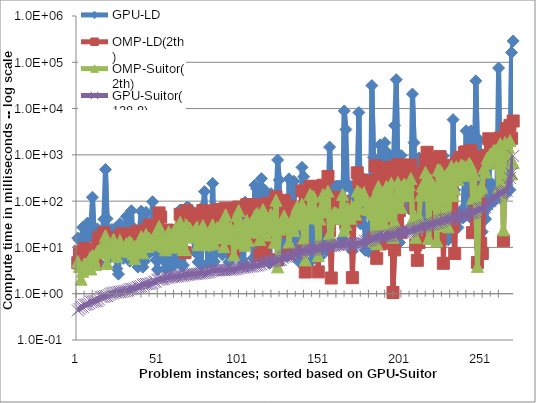
| Category | GPU-LD | OMP-LD(2th) | OMP-Suitor(2th) | GPU-Suitor(128,8) |
|---|---|---|---|---|
| 0 | 15.91 | 4.671 | 4.951 | 0.434 |
| 1 | 14.461 | 8.024 | 3.904 | 0.469 |
| 2 | 7.775 | 4.176 | 2.056 | 0.506 |
| 3 | 27.187 | 5.994 | 3.056 | 0.526 |
| 4 | 14.246 | 9.438 | 4.422 | 0.57 |
| 5 | 4.107 | 6.901 | 4.413 | 0.583 |
| 6 | 33.759 | 8.322 | 4.343 | 0.593 |
| 7 | 16.807 | 8.298 | 5.392 | 0.621 |
| 8 | 25.256 | 8.299 | 3.427 | 0.663 |
| 9 | 121.316 | 7.65 | 6.718 | 0.679 |
| 10 | 19.372 | 7.215 | 5.441 | 0.685 |
| 11 | 6.16 | 4.676 | 4.297 | 0.694 |
| 12 | 25.181 | 11.028 | 8.163 | 0.702 |
| 13 | 4.747 | 16.526 | 8.479 | 0.752 |
| 14 | 20.518 | 10.923 | 9.682 | 0.847 |
| 15 | 23.158 | 10.789 | 7.65 | 0.859 |
| 16 | 40.667 | 20.636 | 9.407 | 0.861 |
| 17 | 483.357 | 15.24 | 18.041 | 0.886 |
| 18 | 41.804 | 10.188 | 4.506 | 0.889 |
| 19 | 12.23 | 14.366 | 7.773 | 0.93 |
| 20 | 6.116 | 8.333 | 9.363 | 0.988 |
| 21 | 24.493 | 15.624 | 7.755 | 1.017 |
| 22 | 12.093 | 16.281 | 14.967 | 1.036 |
| 23 | 25.358 | 16.376 | 7.733 | 1.062 |
| 24 | 3.473 | 11.929 | 6.462 | 1.062 |
| 25 | 2.648 | 9.246 | 10.371 | 1.087 |
| 26 | 32.742 | 14.391 | 13.728 | 1.089 |
| 27 | 15.403 | 19.722 | 10.891 | 1.111 |
| 28 | 5.821 | 9.11 | 9.56 | 1.12 |
| 29 | 27.19 | 16.952 | 8.691 | 1.139 |
| 30 | 46.903 | 17.445 | 12.319 | 1.157 |
| 31 | 27.356 | 19.223 | 8.191 | 1.188 |
| 32 | 5.051 | 11.936 | 13.262 | 1.246 |
| 33 | 61.984 | 16.839 | 12.208 | 1.266 |
| 34 | 10.684 | 14.485 | 7.226 | 1.272 |
| 35 | 24.961 | 13.737 | 5.759 | 1.294 |
| 36 | 10.868 | 21.941 | 10.565 | 1.337 |
| 37 | 3.775 | 14.532 | 9.298 | 1.403 |
| 38 | 24.833 | 16.702 | 8.737 | 1.412 |
| 39 | 60.601 | 22.22 | 17.133 | 1.454 |
| 40 | 3.756 | 13.181 | 7.65 | 1.558 |
| 41 | 5.01 | 20.472 | 10.507 | 1.598 |
| 42 | 57.403 | 23.839 | 18.982 | 1.617 |
| 43 | 7.087 | 14.071 | 10.607 | 1.627 |
| 44 | 24.702 | 30.407 | 15.87 | 1.637 |
| 45 | 8.73 | 19.257 | 14.334 | 1.67 |
| 46 | 97.021 | 28.357 | 14.916 | 1.688 |
| 47 | 8.382 | 17.689 | 17.046 | 1.8 |
| 48 | 5.353 | 18.171 | 13.657 | 1.819 |
| 49 | 3.316 | 12.181 | 11.375 | 1.994 |
| 50 | 39.511 | 55.622 | 28.408 | 2.027 |
| 51 | 16.812 | 45.498 | 19.664 | 2.057 |
| 52 | 5.474 | 17.762 | 15.929 | 2.066 |
| 53 | 11.148 | 13.124 | 10.517 | 2.067 |
| 54 | 3.452 | 13.478 | 8.896 | 2.194 |
| 55 | 18.18 | 23.74 | 11.082 | 2.223 |
| 56 | 8.872 | 14.38 | 21.959 | 2.236 |
| 57 | 3.766 | 15.569 | 10.246 | 2.296 |
| 58 | 4.335 | 14.012 | 13.837 | 2.297 |
| 59 | 4.04 | 14.975 | 10.608 | 2.321 |
| 60 | 6.384 | 23.106 | 25.558 | 2.35 |
| 61 | 5.572 | 14.674 | 10.248 | 2.37 |
| 62 | 6.103 | 18.702 | 17.811 | 2.389 |
| 63 | 64.244 | 52.032 | 35.081 | 2.453 |
| 64 | 3.946 | 27.133 | 10.343 | 2.455 |
| 65 | 4.143 | 17.925 | 8.994 | 2.462 |
| 66 | 16.515 | 7.702 | 9.097 | 2.553 |
| 67 | 73.311 | 62.437 | 30.066 | 2.564 |
| 68 | 73.561 | 44.112 | 26.458 | 2.579 |
| 69 | 67.333 | 46.48 | 25.918 | 2.62 |
| 70 | 18.768 | 24.846 | 16.701 | 2.631 |
| 71 | 18.806 | 28.494 | 17.794 | 2.649 |
| 72 | 8.046 | 31.339 | 23.272 | 2.676 |
| 73 | 24.874 | 53.236 | 26.586 | 2.688 |
| 74 | 4.811 | 17.181 | 11.471 | 2.707 |
| 75 | 4.729 | 16.659 | 14.682 | 2.739 |
| 76 | 4.266 | 17.142 | 12.431 | 2.762 |
| 77 | 75.829 | 62.507 | 29.531 | 2.815 |
| 78 | 160.408 | 43.318 | 24.712 | 2.831 |
| 79 | 27.003 | 13.859 | 13.522 | 2.845 |
| 80 | 4.508 | 20.349 | 11.454 | 2.908 |
| 81 | 11.272 | 24.473 | 21.432 | 2.95 |
| 82 | 4.696 | 23.65 | 17.106 | 3.078 |
| 83 | 242.102 | 59.52 | 30.832 | 3.174 |
| 84 | 4.949 | 22.423 | 11.947 | 3.184 |
| 85 | 7.637 | 13.268 | 18.974 | 3.188 |
| 86 | 26.871 | 66.194 | 27.583 | 3.207 |
| 87 | 22.332 | 23.972 | 17.137 | 3.221 |
| 88 | 41.367 | 62.46 | 30.074 | 3.225 |
| 89 | 6.899 | 30.416 | 16.284 | 3.228 |
| 90 | 22.581 | 23.894 | 10.453 | 3.248 |
| 91 | 29.436 | 70.668 | 50.611 | 3.268 |
| 92 | 20.323 | 13.704 | 17.381 | 3.296 |
| 93 | 4.778 | 26.608 | 15.449 | 3.302 |
| 94 | 46.016 | 20.243 | 26.877 | 3.32 |
| 95 | 14.278 | 42.363 | 21.789 | 3.324 |
| 96 | 70.263 | 8.672 | 6.894 | 3.373 |
| 97 | 47.326 | 38.677 | 23.344 | 3.409 |
| 98 | 29.633 | 71.311 | 48.939 | 3.475 |
| 99 | 29.668 | 74.705 | 62.669 | 3.554 |
| 100 | 52 | 19.494 | 12.541 | 3.635 |
| 101 | 5.557 | 29.032 | 15.808 | 3.67 |
| 102 | 4.632 | 25.605 | 22.196 | 3.688 |
| 103 | 95.19 | 20.041 | 11.142 | 3.714 |
| 104 | 50.421 | 83.706 | 38.346 | 3.765 |
| 105 | 58.29 | 25.495 | 14.001 | 3.843 |
| 106 | 16.184 | 13.855 | 29.1 | 3.872 |
| 107 | 71.167 | 75.136 | 34.527 | 3.886 |
| 108 | 5.853 | 35.458 | 22.7 | 3.938 |
| 109 | 221.72 | 84.412 | 47.925 | 4.04 |
| 110 | 186.194 | 79.814 | 53.618 | 4.088 |
| 111 | 7.156 | 33.644 | 21.39 | 4.093 |
| 112 | 11.365 | 6.715 | 14.809 | 4.294 |
| 113 | 306.585 | 79.347 | 45.059 | 4.316 |
| 114 | 65.668 | 83.125 | 65.905 | 4.669 |
| 115 | 173.012 | 8.405 | 19.662 | 4.715 |
| 116 | 8.342 | 21.781 | 18.526 | 4.75 |
| 117 | 76.257 | 88.575 | 38.06 | 4.819 |
| 118 | 4.55 | 24.609 | 23.56 | 4.97 |
| 119 | 144.848 | 85.721 | 51.586 | 4.992 |
| 120 | 100.81 | 91.744 | 46.888 | 5.081 |
| 121 | 68.162 | 13.968 | 12.944 | 5.099 |
| 122 | 78.563 | 123.754 | 104.229 | 5.16 |
| 123 | 776.093 | 5.425 | 3.808 | 5.319 |
| 124 | 286.859 | 51.372 | 24.799 | 5.344 |
| 125 | 6.49 | 50.586 | 33.079 | 5.404 |
| 126 | 10.149 | 52.933 | 35.224 | 5.952 |
| 127 | 15.554 | 104.255 | 47.896 | 6.279 |
| 128 | 6.467 | 22.473 | 27.684 | 6.383 |
| 129 | 6.48 | 22.731 | 28.602 | 6.385 |
| 130 | 303.041 | 7.388 | 13.025 | 6.418 |
| 131 | 34.222 | 78.032 | 34.668 | 6.676 |
| 132 | 13.256 | 67.458 | 35.968 | 6.727 |
| 133 | 268.368 | 42.662 | 23.183 | 7.166 |
| 134 | 9.355 | 69.378 | 59.187 | 7.32 |
| 135 | 9.32 | 67.561 | 76.043 | 7.336 |
| 136 | 4.992 | 52.849 | 32.252 | 7.565 |
| 137 | 11.056 | 72.036 | 58.084 | 8.139 |
| 138 | 536.933 | 166.699 | 86.084 | 8.317 |
| 139 | 335.604 | 10.41 | 15.832 | 8.49 |
| 140 | 88.16 | 2.943 | 5.371 | 8.606 |
| 141 | 136.404 | 120.445 | 54.54 | 8.699 |
| 142 | 137.257 | 119.277 | 49.515 | 8.708 |
| 143 | 67.132 | 206.891 | 140.702 | 8.871 |
| 144 | 5.284 | 62.991 | 43.368 | 8.999 |
| 145 | 105.157 | 209.984 | 127.385 | 9.089 |
| 146 | 141.964 | 118.16 | 59.346 | 9.227 |
| 147 | 142.144 | 161.371 | 55.385 | 9.242 |
| 148 | 86.877 | 2.958 | 6.677 | 9.416 |
| 149 | 6.126 | 69.006 | 41.222 | 9.628 |
| 150 | 13.384 | 113.279 | 75.303 | 10.167 |
| 151 | 73.815 | 220.619 | 139.243 | 10.375 |
| 152 | 21.417 | 53.935 | 61.329 | 10.399 |
| 153 | 8.442 | 34.394 | 58.346 | 10.587 |
| 154 | 95.644 | 342.48 | 164.642 | 10.677 |
| 155 | 1472.353 | 23.083 | 19.941 | 10.683 |
| 156 | 173.082 | 2.184 | 16.588 | 10.713 |
| 157 | 140.48 | 119.066 | 50.881 | 10.936 |
| 158 | 140.272 | 121.598 | 57.263 | 10.952 |
| 159 | 211.108 | 79.339 | 54.131 | 11.32 |
| 160 | 209.355 | 43.413 | 52.049 | 11.347 |
| 161 | 211.576 | 43.663 | 42.811 | 11.357 |
| 162 | 210.026 | 42.311 | 53.413 | 11.446 |
| 163 | 15.481 | 99.941 | 139.92 | 11.491 |
| 164 | 8879.896 | 80.057 | 23.594 | 11.527 |
| 165 | 3533.738 | 33.689 | 31.623 | 11.74 |
| 166 | 210.317 | 44.394 | 71.165 | 11.771 |
| 167 | 210.443 | 44.496 | 48.25 | 11.835 |
| 168 | 209.991 | 44.313 | 42.793 | 11.882 |
| 169 | 8.292 | 2.225 | 74.822 | 11.895 |
| 170 | 210.954 | 45.587 | 63.394 | 11.9 |
| 171 | 211.345 | 44.229 | 52.286 | 11.904 |
| 172 | 150.113 | 408.965 | 164.845 | 12.093 |
| 173 | 8233.118 | 259.234 | 68.309 | 12.24 |
| 174 | 32.175 | 200.357 | 145.33 | 12.381 |
| 175 | 324.316 | 285.999 | 127.25 | 12.609 |
| 176 | 97.268 | 268.64 | 150.216 | 12.64 |
| 177 | 8.645 | 115.094 | 104.998 | 13.57 |
| 178 | 26.68 | 149.283 | 76.374 | 13.873 |
| 179 | 8.127 | 104.636 | 66.056 | 14.246 |
| 180 | 26.852 | 123.141 | 83.438 | 14.42 |
| 181 | 31426.301 | 269.817 | 52.853 | 15.104 |
| 182 | 882.094 | 16.098 | 13.374 | 15.867 |
| 183 | 178.513 | 580.676 | 133.38 | 16.031 |
| 184 | 139.54 | 5.82 | 12.114 | 16.344 |
| 185 | 135.965 | 445.644 | 206.207 | 16.948 |
| 186 | 1642.178 | 11.856 | 33.477 | 16.975 |
| 187 | 28.124 | 152.563 | 103.757 | 17.258 |
| 188 | 214.153 | 253.57 | 156.042 | 17.418 |
| 189 | 1832.394 | 51.476 | 30.832 | 17.488 |
| 190 | 899.792 | 522.7 | 207.994 | 17.514 |
| 191 | 1077.128 | 13.47 | 53.371 | 17.628 |
| 192 | 947.861 | 12.359 | 48.673 | 17.773 |
| 193 | 685.963 | 541.15 | 244.588 | 17.909 |
| 194 | 65.351 | 1.062 | 16.61 | 18.845 |
| 195 | 4340.279 | 8.861 | 36.285 | 19.159 |
| 196 | 42168.853 | 400.564 | 108.46 | 20.064 |
| 197 | 435.849 | 612.615 | 253.059 | 20.183 |
| 198 | 12.758 | 63.053 | 131.236 | 21.037 |
| 199 | 970.787 | 21.252 | 73.556 | 21.104 |
| 200 | 171.587 | 600.321 | 216.355 | 21.549 |
| 201 | 221.175 | 507.342 | 234.496 | 21.647 |
| 202 | 115.447 | 438.413 | 131.219 | 21.852 |
| 203 | 127.949 | 187.35 | 134.124 | 22.052 |
| 204 | 67.974 | 418.337 | 226.749 | 22.443 |
| 205 | 197.977 | 604.533 | 308.825 | 23.168 |
| 206 | 20652.12 | 212.265 | 40.216 | 23.771 |
| 207 | 1838.366 | 73.221 | 45.544 | 24.42 |
| 208 | 213.664 | 11.379 | 16.552 | 25.251 |
| 209 | 502.639 | 5.268 | 28.544 | 25.721 |
| 210 | 857.896 | 12.79 | 47.102 | 26.195 |
| 211 | 56.396 | 161.621 | 135.775 | 27.119 |
| 212 | 54.874 | 396.219 | 213.25 | 28.275 |
| 213 | 25.34 | 333.799 | 159.573 | 29.628 |
| 214 | 824.489 | 758.804 | 419.043 | 29.653 |
| 215 | 446.431 | 1137.404 | 306.105 | 29.908 |
| 216 | 875.725 | 22.859 | 15.648 | 31.467 |
| 217 | 26.486 | 291.665 | 292.556 | 31.48 |
| 218 | 285.582 | 711.428 | 217.923 | 31.927 |
| 219 | 28.116 | 42.354 | 120.679 | 32.096 |
| 220 | 186.403 | 31.705 | 86.341 | 33.58 |
| 221 | 264.547 | 17.409 | 13.929 | 34.069 |
| 222 | 886.827 | 851.958 | 483.021 | 34.433 |
| 223 | 370.252 | 917.234 | 457.189 | 36.747 |
| 224 | 47.198 | 572.38 | 407.964 | 37.145 |
| 225 | 945.879 | 4.547 | 29.801 | 39.772 |
| 226 | 96.675 | 141.861 | 248.808 | 39.777 |
| 227 | 33.442 | 489.306 | 382.444 | 39.807 |
| 228 | 14.522 | 50.455 | 27.834 | 40.797 |
| 229 | 22.821 | 593.963 | 188.937 | 41.088 |
| 230 | 52.929 | 582.098 | 566.524 | 41.567 |
| 231 | 5771.815 | 28.896 | 132.101 | 43.861 |
| 232 | 174.518 | 7.415 | 182.592 | 44.565 |
| 233 | 56.878 | 659.535 | 554.866 | 44.732 |
| 234 | 26.888 | 467.464 | 294.792 | 48.049 |
| 235 | 48.316 | 880.351 | 491.734 | 48.755 |
| 236 | 62.724 | 692.117 | 606.813 | 49.314 |
| 237 | 43.213 | 650.07 | 578.482 | 49.669 |
| 238 | 275.035 | 1121.84 | 364.276 | 51.036 |
| 239 | 3315.356 | 1160.706 | 545.708 | 51.252 |
| 240 | 166.45 | 990.222 | 465.722 | 52.117 |
| 241 | 46.583 | 666.176 | 649.756 | 53.686 |
| 242 | 3285.035 | 1244.329 | 577.21 | 55.325 |
| 243 | 231.448 | 20.866 | 116.007 | 55.394 |
| 244 | 114.017 | 845.031 | 376.143 | 56.669 |
| 245 | 39677.999 | 501.418 | 69.049 | 59.167 |
| 246 | 1255.537 | 4.738 | 3.896 | 63.239 |
| 247 | 2117.228 | 49.586 | 165.771 | 68.108 |
| 248 | 22.7 | 12.154 | 192.093 | 68.492 |
| 249 | 21.72 | 7.414 | 196.825 | 69.144 |
| 250 | 40.932 | 905.769 | 513.99 | 71.937 |
| 251 | 41.029 | 744.191 | 425.281 | 73.766 |
| 252 | 70.899 | 967.716 | 852.922 | 85.896 |
| 253 | 539.965 | 2221.659 | 660.938 | 98.422 |
| 254 | 89.335 | 1536.401 | 1044.945 | 100.26 |
| 255 | 237.769 | 1707.623 | 753.503 | 112.268 |
| 256 | 99.422 | 1805.234 | 1237.602 | 117.291 |
| 257 | 106.536 | 1964.376 | 1233.601 | 127.062 |
| 258 | 166.859 | 2149.001 | 875.121 | 132.922 |
| 259 | 75054.001 | 965.942 | 196.655 | 149.521 |
| 260 | 131.076 | 2307.761 | 1739.421 | 150.227 |
| 261 | 108.25 | 1847.22 | 1063.457 | 152.016 |
| 262 | 181.925 | 13.967 | 23.959 | 155.816 |
| 263 | 141.39 | 2576.309 | 1846.06 | 163.174 |
| 264 | 932.804 | 3713.805 | 1067.95 | 169.006 |
| 265 | 496.242 | 3702.297 | 1469.685 | 222.383 |
| 266 | 176.468 | 4328.589 | 2026.781 | 316.213 |
| 267 | 162499.711 | 2278.245 | 386.918 | 394.602 |
| 268 | 288665.467 | 5389.024 | 678.129 | 947.382 |